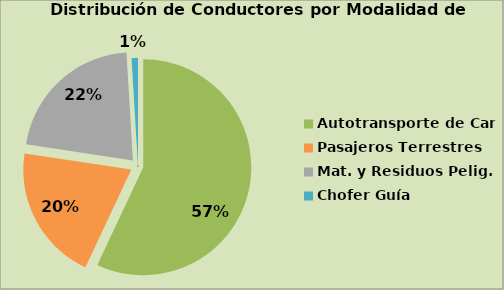
| Category | Series 0 |
|---|---|
| Autotransporte de Carga | 56.989 |
| Pasajeros Terrestres | 20.395 |
| Mat. y Residuos Pelig. | 21.664 |
| Chofer Guía | 0.952 |